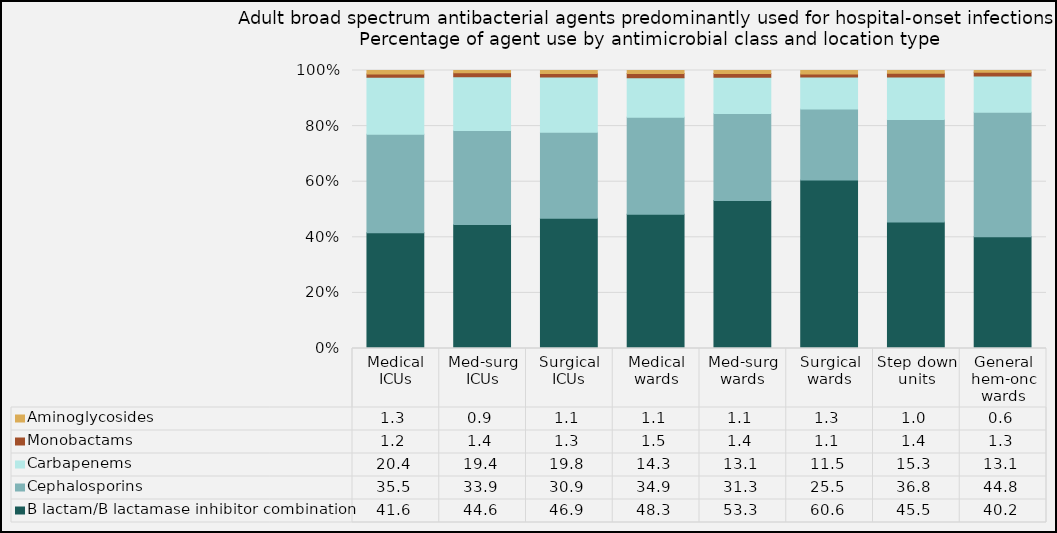
| Category | B lactam/B lactamase inhibitor combination | Cephalosporins | Carbapenems | Monobactams | Aminoglycosides |
|---|---|---|---|---|---|
| Medical ICUs | 41.6 | 35.5 | 20.43 | 1.17 | 1.29 |
| Med-surg ICUs | 44.57 | 33.86 | 19.37 | 1.36 | 0.85 |
| Surgical ICUs | 46.88 | 30.91 | 19.83 | 1.31 | 1.07 |
| Medical wards | 48.25 | 34.89 | 14.26 | 1.53 | 1.07 |
| Med-surg wards | 53.25 | 31.26 | 13.05 | 1.39 | 1.06 |
| Surgical wards | 60.64 | 25.52 | 11.48 | 1.11 | 1.25 |
| Step down units | 45.52 | 36.84 | 15.28 | 1.39 | 0.97 |
| General hem-onc wards | 40.17 | 44.79 | 13.1 | 1.31 | 0.63 |